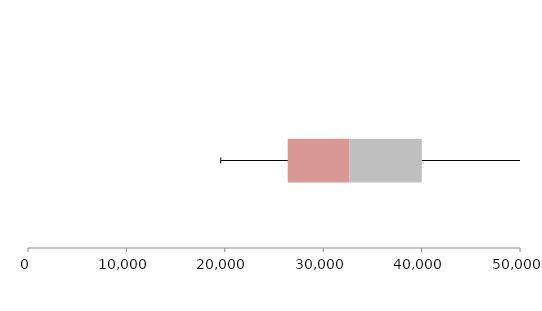
| Category | Series 1 | Series 2 | Series 3 |
|---|---|---|---|
| 0 | 26394.673 | 6246.034 | 7377.832 |